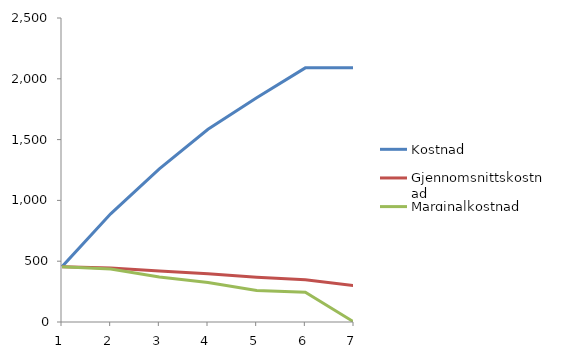
| Category | Kostnad | Gjennomsnittskostnad | Marginalkostnad |
|---|---|---|---|
| 0 | 455 | 455 | 455 |
| 1 | 890 | 445 | 435 |
| 2 | 1260 | 420 | 370 |
| 3 | 1585 | 396.25 | 325 |
| 4 | 1845 | 369 | 260 |
| 5 | 2090 | 348.333 | 245 |
| 6 | 2090 | 298.571 | 0 |